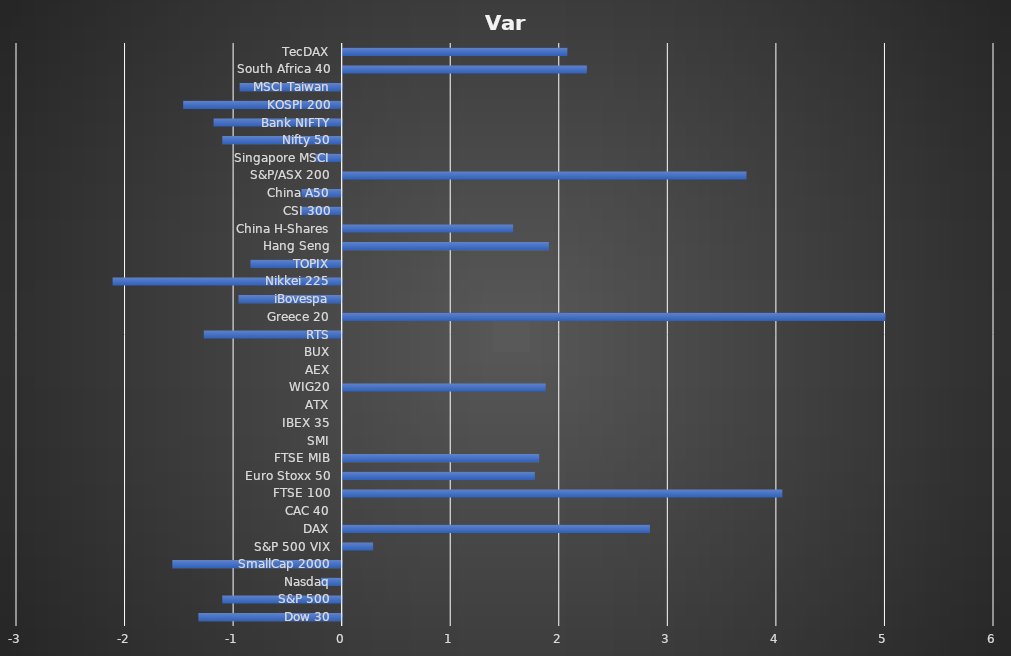
| Category | Var (%) |
|---|---|
| Dow 30 | -1.32 |
| S&P 500 | -1.1 |
| Nasdaq | -0.19 |
| SmallCap 2000 | -1.56 |
| S&P 500 VIX | 0.28 |
| DAX | 2.83 |
| CAC 40 | 0 |
| FTSE 100 | 4.05 |
| Euro Stoxx 50 | 1.77 |
| FTSE MIB | 1.81 |
| SMI | 0 |
| IBEX 35 | 0 |
| ATX | 0 |
| WIG20 | 1.87 |
| AEX | 0 |
| BUX | 0 |
| RTS | -1.27 |
| Greece 20 | 5 |
| iBovespa | -0.95 |
| Nikkei 225 | -2.11 |
| TOPIX | -0.84 |
| Hang Seng | 1.9 |
| China H-Shares | 1.57 |
| CSI 300 | -0.38 |
| China A50 | -0.37 |
| S&P/ASX 200 | 3.72 |
| Singapore MSCI | -0.24 |
| Nifty 50 | -1.1 |
| Bank NIFTY | -1.18 |
| KOSPI 200 | -1.46 |
| MSCI Taiwan | -0.94 |
| South Africa 40 | 2.25 |
| TecDAX | 2.07 |